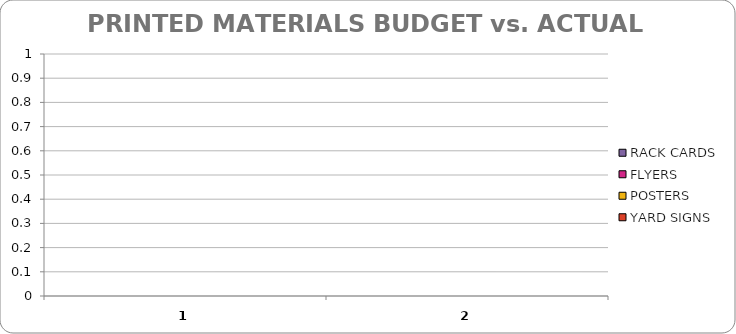
| Category | YARD SIGNS | POSTERS | FLYERS | RACK CARDS |
|---|---|---|---|---|
| 0 | 0 | 0 | 0 | 0 |
| 1 | 0 | 0 | 0 | 0 |